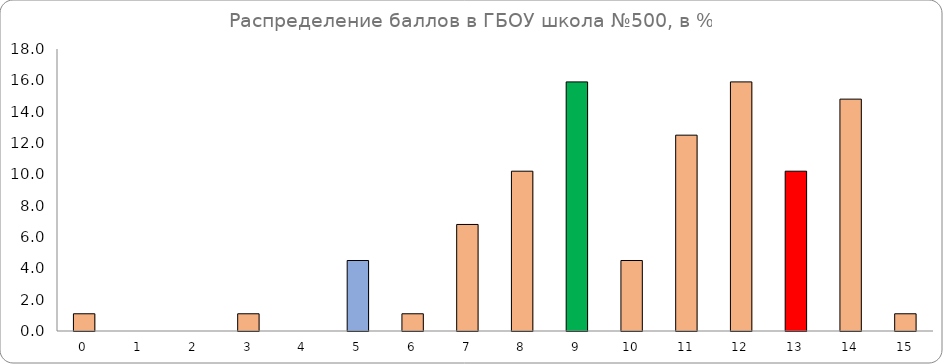
| Category | Series 0 |
|---|---|
| 0.0 | 1.1 |
| 1.0 | 0 |
| 2.0 | 0 |
| 3.0 | 1.1 |
| 4.0 | 0 |
| 5.0 | 4.5 |
| 6.0 | 1.1 |
| 7.0 | 6.8 |
| 8.0 | 10.2 |
| 9.0 | 15.9 |
| 10.0 | 4.5 |
| 11.0 | 12.5 |
| 12.0 | 15.9 |
| 13.0 | 10.2 |
| 14.0 | 14.8 |
| 15.0 | 1.1 |